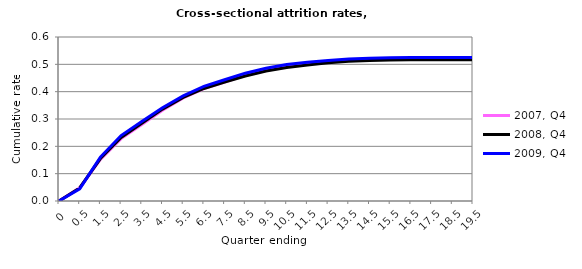
| Category | 2007, Q4 | 2008, Q4 | 2009, Q4 |
|---|---|---|---|
| 0.0 | 0 | 0 | 0 |
| 0.5 | 0.048 | 0.048 | 0.045 |
| 1.5 | 0.152 | 0.155 | 0.161 |
| 2.5 | 0.228 | 0.233 | 0.239 |
| 3.5 | 0.28 | 0.284 | 0.291 |
| 4.5 | 0.332 | 0.336 | 0.341 |
| 5.5 | 0.377 | 0.379 | 0.385 |
| 6.5 | 0.411 | 0.412 | 0.419 |
| 7.5 | 0.435 | 0.435 | 0.443 |
| 8.5 | 0.46 | 0.458 | 0.468 |
| 9.5 | 0.478 | 0.475 | 0.485 |
| 10.5 | 0.491 | 0.489 | 0.5 |
| 11.5 | 0.501 | 0.497 | 0.508 |
| 12.5 | 0.51 | 0.506 | 0.514 |
| 13.5 | 0.516 | 0.511 | 0.52 |
| 14.5 | 0.52 | 0.514 | 0.523 |
| 15.5 | 0.521 | 0.516 | 0.524 |
| 16.5 | 0.522 | 0.517 | 0.525 |
| 17.5 | 0.523 | 0.517 | 0.525 |
| 18.5 | 0.523 | 0.517 | 0.525 |
| 19.5 | 0.523 | 0.517 | 0.525 |